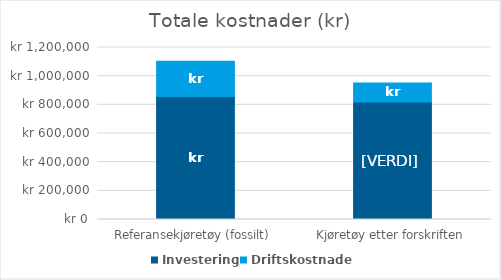
| Category | Investering | Driftskostnader |
|---|---|---|
| Referansekjøretøy (fossilt) | 857286 | 247344.3 |
| Kjøretøy etter forskriften | 820395 | 132516.9 |